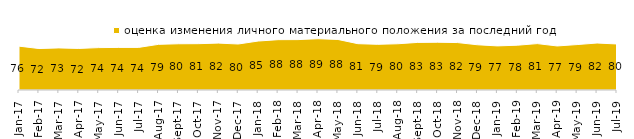
| Category | оценка изменения личного материального положения за последний год |
|---|---|
| 2017-01-01 | 76.3 |
| 2017-02-01 | 72.1 |
| 2017-03-01 | 73.2 |
| 2017-04-01 | 72.3 |
| 2017-05-01 | 73.7 |
| 2017-06-01 | 74.05 |
| 2017-07-01 | 74.1 |
| 2017-08-01 | 79.4 |
| 2017-09-01 | 80.4 |
| 2017-10-01 | 80.55 |
| 2017-11-01 | 81.55 |
| 2017-12-01 | 80 |
| 2018-01-01 | 85.15 |
| 2018-02-01 | 87.55 |
| 2018-03-01 | 87.65 |
| 2018-04-01 | 89.15 |
| 2018-05-01 | 87.9 |
| 2018-06-01 | 80.55 |
| 2018-07-01 | 79.45 |
| 2018-08-01 | 80.4 |
| 2018-09-01 | 82.75 |
| 2018-10-01 | 83.05 |
| 2018-11-01 | 82.485 |
| 2018-12-01 | 78.65 |
| 2019-01-01 | 76.7 |
| 2019-02-01 | 77.9 |
| 2019-03-01 | 80.656 |
| 2019-04-01 | 76.584 |
| 2019-05-01 | 79 |
| 2019-06-01 | 81.696 |
| 2019-07-01 | 80.05 |